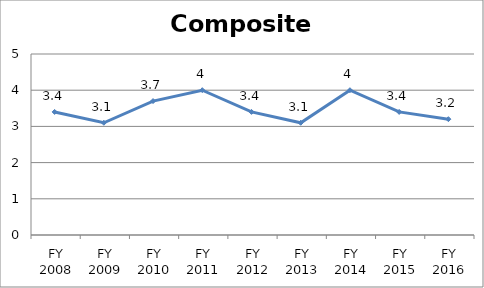
| Category | Composite score |
|---|---|
| FY 2016 | 3.2 |
| FY 2015 | 3.4 |
| FY 2014 | 4 |
| FY 2013 | 3.1 |
| FY 2012 | 3.4 |
| FY 2011 | 4 |
| FY 2010 | 3.7 |
| FY 2009 | 3.1 |
| FY 2008 | 3.4 |